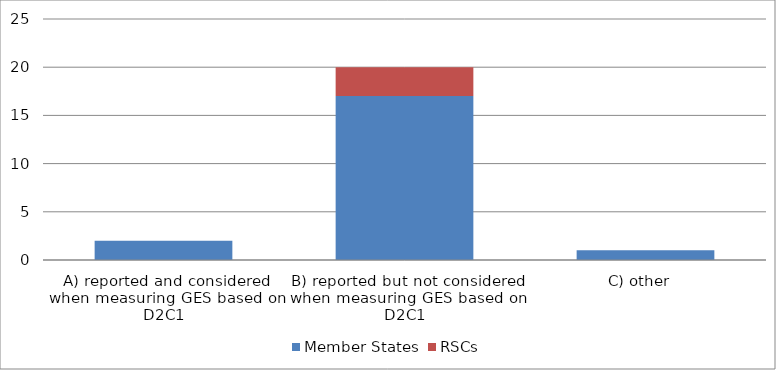
| Category | Member States | RSCs |
|---|---|---|
| A) reported and considered when measuring GES based on D2C1 | 2 | 0 |
| B) reported but not considered when measuring GES based on D2C1 | 17 | 3 |
| C) other   | 1 | 0 |